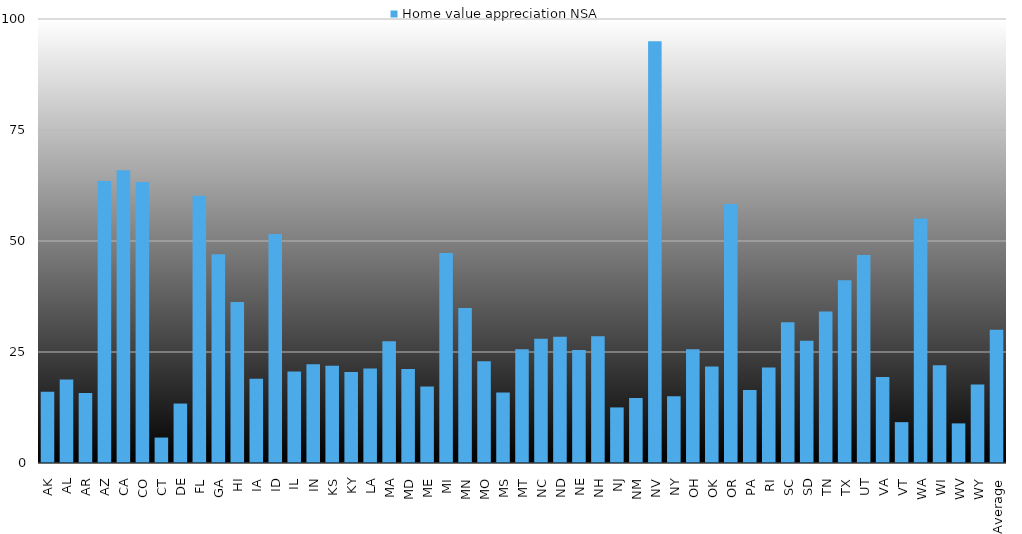
| Category | Home value appreciation NSA |
|---|---|
| AK | 16.05 |
| AL | 18.81 |
| AR | 15.75 |
| AZ | 63.5 |
| CA | 65.95 |
| CO | 63.31 |
| CT | 5.73 |
| DE | 13.39 |
| FL | 60.18 |
| GA | 47.03 |
| HI | 36.26 |
| IA | 19 |
| ID | 51.57 |
| IL | 20.58 |
| IN | 22.24 |
| KS | 21.91 |
| KY | 20.52 |
| LA | 21.28 |
| MA | 27.41 |
| MD | 21.18 |
| ME | 17.24 |
| MI | 47.28 |
| MN | 34.9 |
| MO | 22.91 |
| MS | 15.86 |
| MT | 25.63 |
| NC | 27.96 |
| ND | 28.44 |
| NE | 25.46 |
| NH | 28.55 |
| NJ | 12.52 |
| NM | 14.65 |
| NV | 94.98 |
| NY | 15.02 |
| OH | 25.64 |
| OK | 21.74 |
| OR | 58.32 |
| PA | 16.44 |
| RI | 21.5 |
| SC | 31.68 |
| SD | 27.51 |
| TN | 34.11 |
| TX | 41.16 |
| UT | 46.85 |
| VA | 19.39 |
| VT | 9.2 |
| WA | 55.07 |
| WI | 22.02 |
| WV | 8.92 |
| WY | 17.68 |
| Average | 30 |